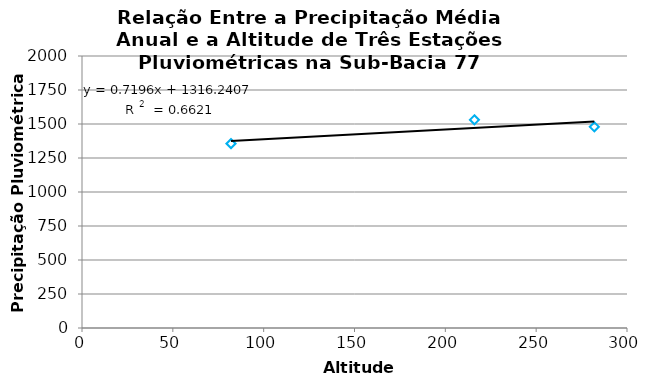
| Category | Series 0 |
|---|---|
| 216.0 | 1531.031 |
| 82.0 | 1355.659 |
| 282.0 | 1479.397 |